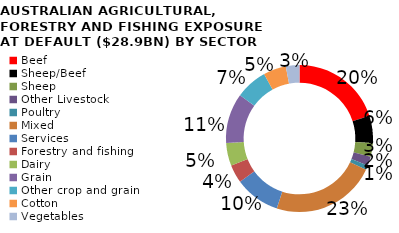
| Category | Australian agricultural, forestry and fishing exposures by sector (%) |
|---|---|
| Beef | 0.2 |
| Sheep/Beef | 0.06 |
| Sheep | 0.03 |
| Other Livestock | 0.02 |
| Poultry | 0.01 |
| Mixed | 0.23 |
| Services | 0.1 |
| Forestry and fishing | 0.04 |
| Dairy | 0.05 |
| Grain | 0.11 |
| Other crop and grain | 0.07 |
| Cotton | 0.05 |
| Vegetables | 0.03 |